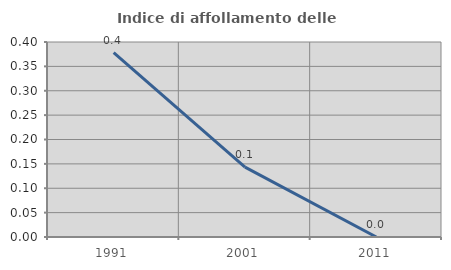
| Category | Indice di affollamento delle abitazioni  |
|---|---|
| 1991.0 | 0.378 |
| 2001.0 | 0.143 |
| 2011.0 | 0 |